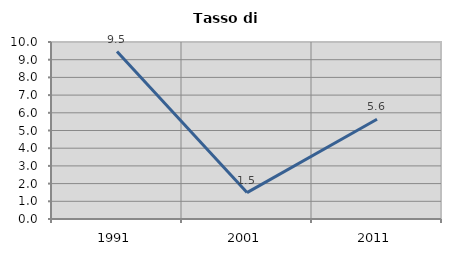
| Category | Tasso di disoccupazione   |
|---|---|
| 1991.0 | 9.459 |
| 2001.0 | 1.493 |
| 2011.0 | 5.634 |